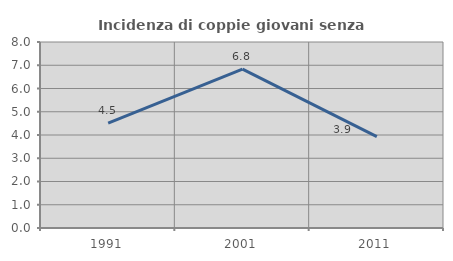
| Category | Incidenza di coppie giovani senza figli |
|---|---|
| 1991.0 | 4.511 |
| 2001.0 | 6.832 |
| 2011.0 | 3.933 |